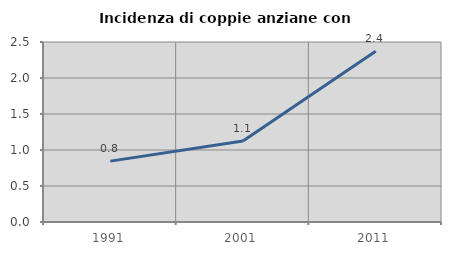
| Category | Incidenza di coppie anziane con figli |
|---|---|
| 1991.0 | 0.846 |
| 2001.0 | 1.124 |
| 2011.0 | 2.373 |